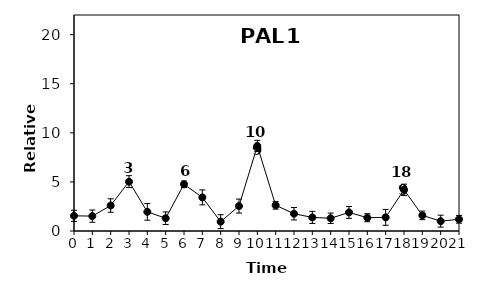
| Category | Series 0 |
|---|---|
| 0.0 | 1.548 |
| 1.0 | 1.516 |
| 2.0 | 2.594 |
| 3.0 | 5.028 |
| 4.0 | 1.952 |
| 5.0 | 1.301 |
| 6.0 | 4.757 |
| 7.0 | 3.422 |
| 8.0 | 0.953 |
| 9.0 | 2.54 |
| 10.0 | 8.664 |
| 11.0 | 2.621 |
| 12.0 | 1.759 |
| 13.0 | 1.385 |
| 14.0 | 1.297 |
| 15.0 | 1.892 |
| 16.0 | 1.352 |
| 17.0 | 1.39 |
| 18.0 | 4.199 |
| 19.0 | 1.591 |
| 20.0 | 1.003 |
| 21.0 | 1.193 |